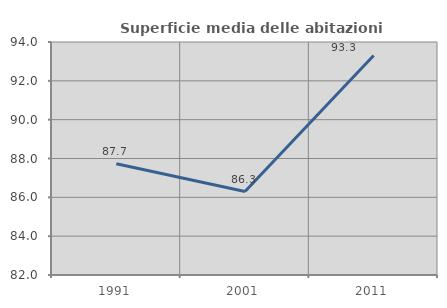
| Category | Superficie media delle abitazioni occupate |
|---|---|
| 1991.0 | 87.725 |
| 2001.0 | 86.296 |
| 2011.0 | 93.302 |